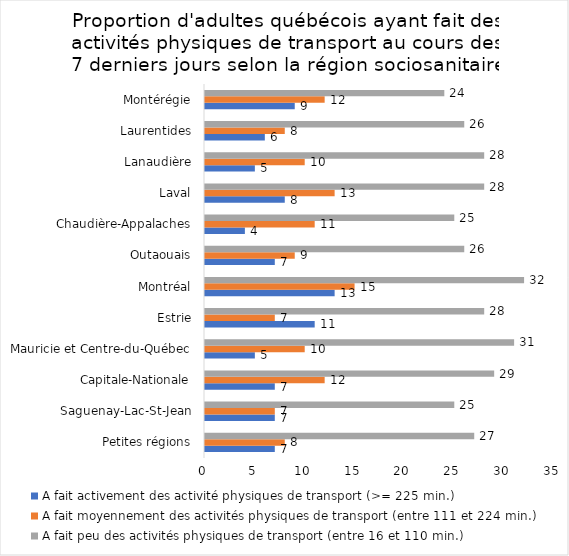
| Category | A fait activement des activité physiques de transport (>= 225 min.) | A fait moyennement des activités physiques de transport (entre 111 et 224 min.) | A fait peu des activités physiques de transport (entre 16 et 110 min.) |
|---|---|---|---|
| Petites régions | 7 | 8 | 27 |
| Saguenay-Lac-St-Jean | 7 | 7 | 25 |
| Capitale-Nationale | 7 | 12 | 29 |
| Mauricie et Centre-du-Québec | 5 | 10 | 31 |
| Estrie | 11 | 7 | 28 |
| Montréal | 13 | 15 | 32 |
| Outaouais | 7 | 9 | 26 |
| Chaudière-Appalaches | 4 | 11 | 25 |
| Laval | 8 | 13 | 28 |
| Lanaudière | 5 | 10 | 28 |
| Laurentides | 6 | 8 | 26 |
| Montérégie | 9 | 12 | 24 |